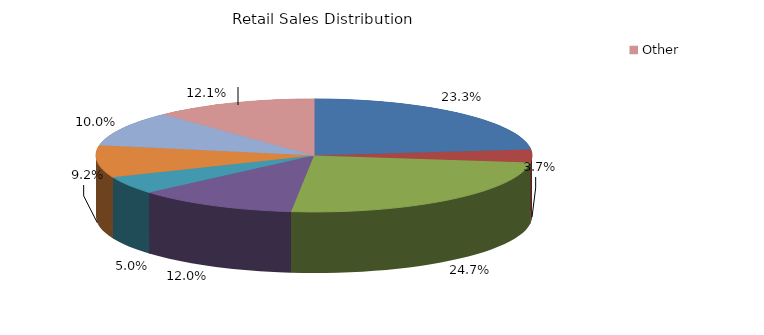
| Category | 23.3% |
|---|---|
| Food | 0.233 |
| Apparel | 0.037 |
| Gen.Merch. | 0.247 |
| Auto | 0.12 |
| Furniture | 0.05 |
| Build Materials | 0.092 |
| Service | 0.1 |
| Other | 0.121 |